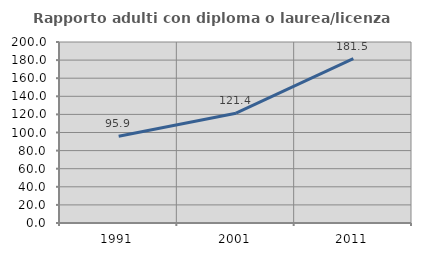
| Category | Rapporto adulti con diploma o laurea/licenza media  |
|---|---|
| 1991.0 | 95.918 |
| 2001.0 | 121.374 |
| 2011.0 | 181.538 |